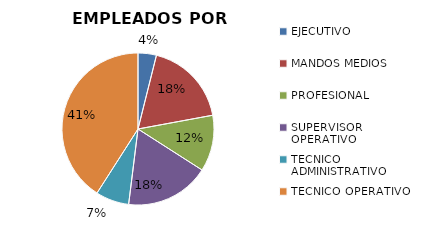
| Category | Series 0 |
|---|---|
| EJECUTIVO | 109 |
| MANDOS MEDIOS | 508 |
| PROFESIONAL | 334 |
| SUPERVISOR OPERATIVO | 500 |
| TECNICO ADMINISTRATIVO | 198 |
| TECNICO OPERATIVO | 1143 |